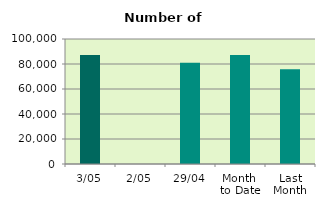
| Category | Series 0 |
|---|---|
| 3/05 | 87140 |
| 2/05 | 0 |
| 29/04 | 81076 |
| Month 
to Date | 87140 |
| Last
Month | 75814.526 |